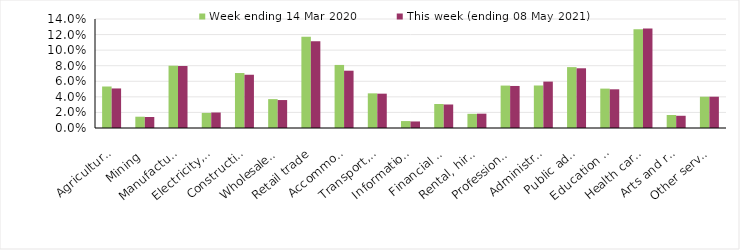
| Category | Week ending 14 Mar 2020 | This week (ending 08 May 2021) |
|---|---|---|
| Agriculture, forestry and fishing | 0.053 | 0.051 |
| Mining | 0.014 | 0.014 |
| Manufacturing | 0.08 | 0.08 |
| Electricity, gas, water and waste services | 0.019 | 0.02 |
| Construction | 0.071 | 0.068 |
| Wholesale trade | 0.037 | 0.036 |
| Retail trade | 0.117 | 0.111 |
| Accommodation and food services | 0.081 | 0.074 |
| Transport, postal and warehousing | 0.044 | 0.044 |
| Information media and telecommunications | 0.009 | 0.008 |
| Financial and insurance services | 0.031 | 0.03 |
| Rental, hiring and real estate services | 0.018 | 0.018 |
| Professional, scientific and technical services | 0.054 | 0.054 |
| Administrative and support services | 0.055 | 0.06 |
| Public administration and safety | 0.078 | 0.077 |
| Education and training | 0.051 | 0.05 |
| Health care and social assistance | 0.127 | 0.128 |
| Arts and recreation services | 0.017 | 0.016 |
| Other services | 0.04 | 0.04 |